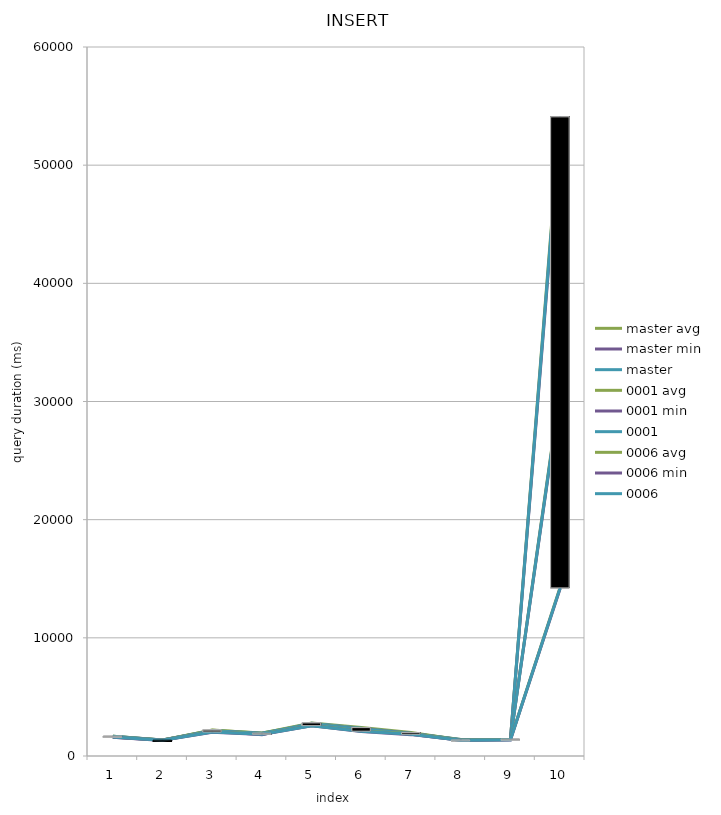
| Category | avg | master min | master | 0001 min | 0001 | 0006 min | 0006 |
|---|---|---|---|---|---|---|---|
| 0 | 1609.564 | 1590.139 | 1625.488 | 1660.019 | 1668.594 | 1587.19 | 1600.863 |
| 1 | 1346.924 | 1321.882 | 1332.886 | 1351.746 | 1355.746 | 1331.127 | 1338.783 |
| 2 | 2045.832 | 2127.336 | 2166.351 | 2119.195 | 2141.909 | 2015.274 | 2035.011 |
| 3 | 1866.041 | 1807.77 | 1874.836 | 1896.907 | 1919.173 | 1824.13 | 1845.642 |
| 4 | 2578.841 | 2752.464 | 2771.488 | 2663.27 | 2686.868 | 2549.382 | 2568.053 |
| 5 | 2121.395 | 2301.121 | 2357.792 | 2278.555 | 2295.71 | 2081.201 | 2101.399 |
| 6 | 1875.918 | 1847.715 | 1923.052 | 1895.478 | 1906.675 | 1808.499 | 1840.25 |
| 7 | 1360.853 | 1335.561 | 1350.633 | 1381.686 | 1387.666 | 1328.522 | 1341.21 |
| 8 | 1390.8 | 1388.04 | 1402.404 | 1417.68 | 1422.16 | 1358.039 | 1370.039 |
| 9 | 14280.593 | 53347.245 | 53754.954 | 30728.843 | 30875.63 | 14166.351 | 14226.528 |